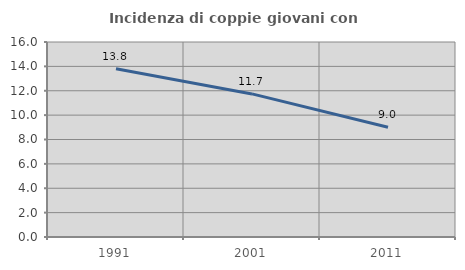
| Category | Incidenza di coppie giovani con figli |
|---|---|
| 1991.0 | 13.81 |
| 2001.0 | 11.741 |
| 2011.0 | 9 |